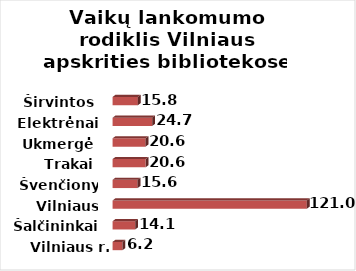
| Category | Series 0 |
|---|---|
| Vilniaus r. | 6.18 |
| Šalčininkai | 14.092 |
| Vilniaus m. | 120.996 |
| Švenčionys | 15.574 |
| Trakai | 20.592 |
| Ukmergė | 20.552 |
| Elektrėnai | 24.702 |
| Širvintos | 15.753 |